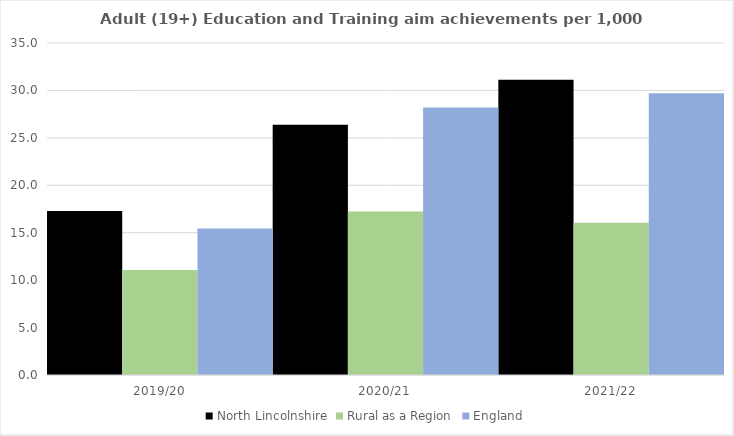
| Category | North Lincolnshire | Rural as a Region | England |
|---|---|---|---|
| 2019/20 | 17.283 | 11.081 | 15.446 |
| 2020/21 | 26.385 | 17.224 | 28.211 |
| 2021/22 | 31.128 | 16.063 | 29.711 |